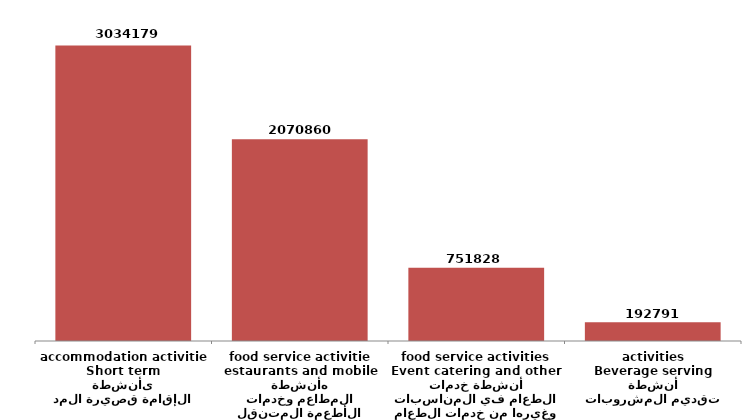
| Category | Series 0 |
|---|---|
| أنشطة الإقامة قصيرة المدى
Short term accommodation activities | 3034179 |
| أنشطة المطاعم وخدمات الأطعمة المتنقله
estaurants and mobile food service activities | 2070860 |
| أنشطة خدمات الطعام في المناسبات وغيرها من خدمات الطعام
Event catering and other food service activities | 751828 |
| أنشطة تقديم المشروبات
Beverage serving activities | 192791 |